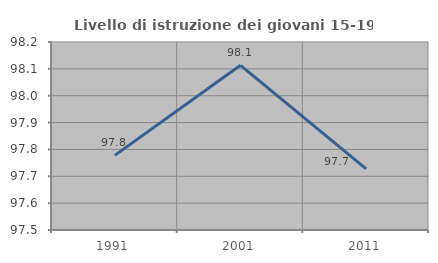
| Category | Livello di istruzione dei giovani 15-19 anni |
|---|---|
| 1991.0 | 97.778 |
| 2001.0 | 98.113 |
| 2011.0 | 97.727 |